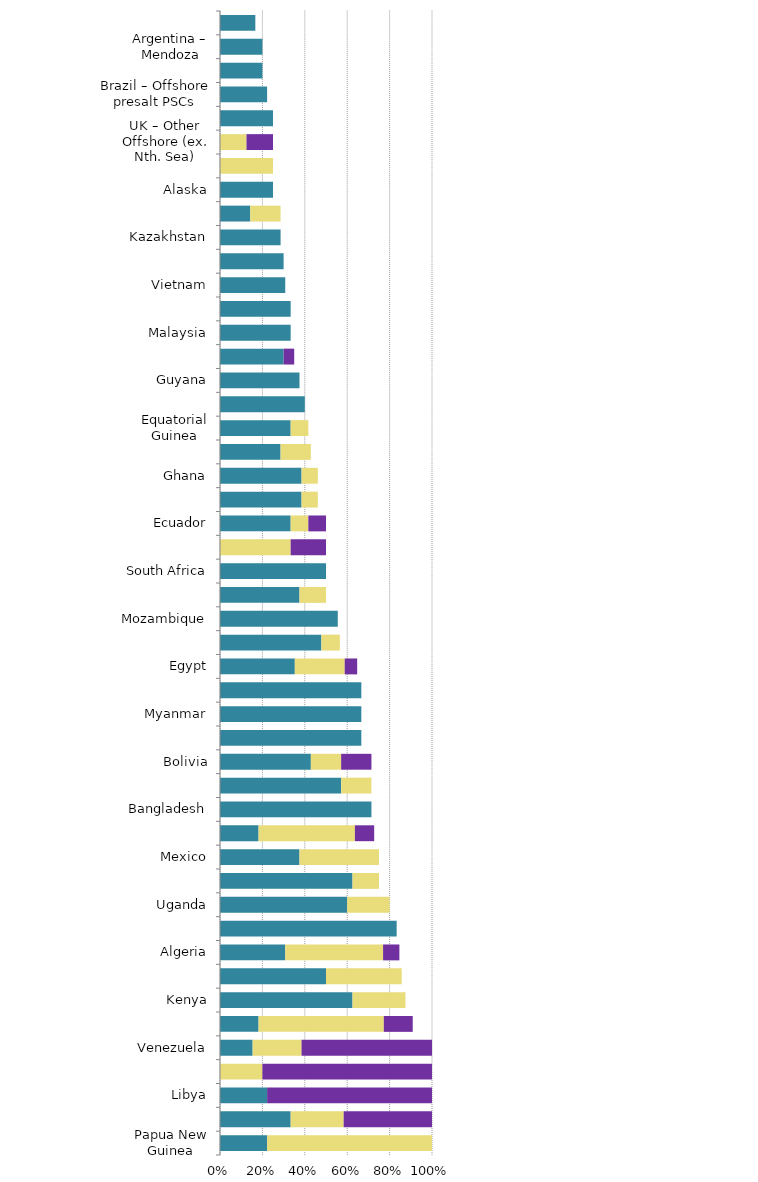
| Category | Mild deterrent to investment | Strong deterrent to investment | Would not pursue investment due to this factor |
|---|---|---|---|
| Papua New Guinea | 0.222 | 0.778 | 0 |
| Iraq | 0.333 | 0.25 | 0.417 |
| Libya | 0.222 | 0 | 0.778 |
| Yemen | 0 | 0.2 | 0.8 |
| Venezuela | 0.154 | 0.231 | 0.615 |
| Nigeria | 0.182 | 0.591 | 0.136 |
| Kenya | 0.625 | 0.25 | 0 |
| Angola | 0.5 | 0.357 | 0 |
| Algeria | 0.308 | 0.462 | 0.077 |
| Cambodia | 0.833 | 0 | 0 |
| Uganda | 0.6 | 0.2 | 0 |
| Rep. of Congo (Brazzaville) | 0.625 | 0.125 | 0 |
| Mexico | 0.375 | 0.375 | 0 |
| Tunisia | 0.182 | 0.455 | 0.091 |
| Bangladesh | 0.714 | 0 | 0 |
| Ivory Coast | 0.571 | 0.143 | 0 |
| Bolivia | 0.429 | 0.143 | 0.143 |
| Indonesia | 0.667 | 0 | 0 |
| Myanmar | 0.667 | 0 | 0 |
| Tanzania | 0.667 | 0 | 0 |
| Egypt | 0.353 | 0.235 | 0.059 |
| Colombia | 0.478 | 0.087 | 0 |
| Mozambique | 0.556 | 0 | 0 |
| Romania | 0.375 | 0.125 | 0 |
| South Africa | 0.5 | 0 | 0 |
| Morocco | 0 | 0.333 | 0.167 |
| Ecuador | 0.333 | 0.083 | 0.083 |
| Gabon | 0.385 | 0.077 | 0 |
| Ghana | 0.385 | 0.077 | 0 |
| Trinidad and Tobago | 0.286 | 0.143 | 0 |
| Equatorial Guinea | 0.333 | 0.083 | 0 |
| Argentina – Santa Cruz | 0.4 | 0 | 0 |
| Guyana | 0.375 | 0 | 0 |
| Peru | 0.3 | 0 | 0.05 |
| Malaysia | 0.333 | 0 | 0 |
| Brazil – Offshore CCs | 0.333 | 0 | 0 |
| Vietnam | 0.308 | 0 | 0 |
| Argentina – Neuquen | 0.3 | 0 | 0 |
| Kazakhstan | 0.286 | 0 | 0 |
| Kuwait | 0.143 | 0.143 | 0 |
| Alaska | 0.25 | 0 | 0 |
| France | 0 | 0.25 | 0 |
| UK – Other Offshore (ex. Nth. Sea) | 0 | 0.125 | 0.125 |
| India | 0.25 | 0 | 0 |
| Brazil – Offshore presalt PSCs | 0.222 | 0 | 0 |
| Nova Scotia | 0.2 | 0 | 0 |
| Argentina – Mendoza | 0.2 | 0 | 0 |
| Poland | 0.167 | 0 | 0 |